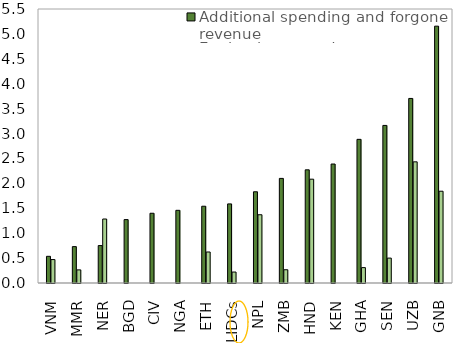
| Category | Additional spending and forgone revenue | Equity, loans, and guarantees |
|---|---|---|
| VNM | 0.536 | 0.47 |
| MMR | 0.73 | 0.263 |
| NER | 0.751 | 1.284 |
| BGD | 1.273 | 0 |
| CIV | 1.4 | 0 |
| NGA | 1.459 | 0 |
| ETH | 1.541 | 0.622 |
| LIDCs | 1.588 | 0.22 |
| NPL | 1.831 | 1.37 |
| ZMB | 2.1 | 0.266 |
| HND | 2.272 | 2.084 |
| KEN | 2.388 | 0 |
| GHA | 2.883 | 0.309 |
| SEN | 3.163 | 0.5 |
| UZB | 3.705 | 2.432 |
| GNB | 5.155 | 1.842 |